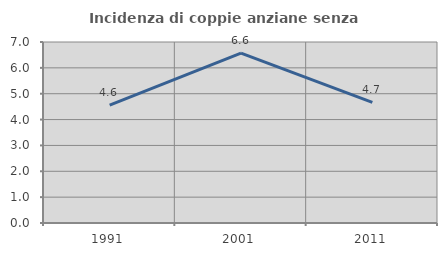
| Category | Incidenza di coppie anziane senza figli  |
|---|---|
| 1991.0 | 4.555 |
| 2001.0 | 6.572 |
| 2011.0 | 4.664 |